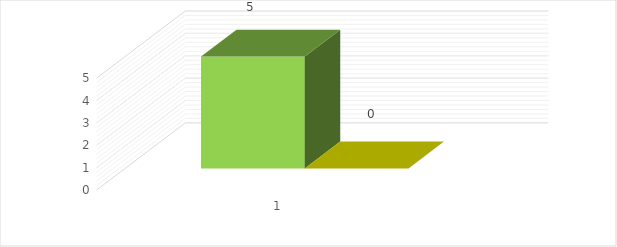
| Category | положительных |
|---|---|
| 0 | 0 |